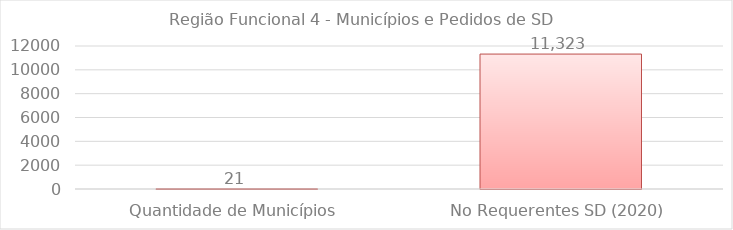
| Category | Litoral |
|---|---|
| Quantidade de Municípios | 21 |
| No Requerentes SD (2020) | 11323 |